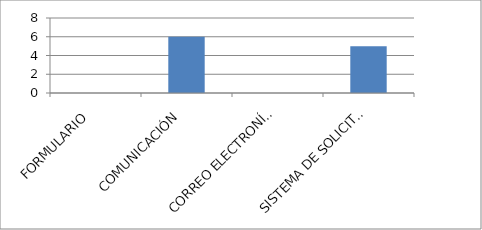
| Category | Series 0 |
|---|---|
| FORMULARIO  | 0 |
| COMUNICACIÓN  | 6 |
| CORREO ELECTRONÍCO  | 0 |
| SISTEMA DE SOLICITUD ONLINE SAIP | 5 |